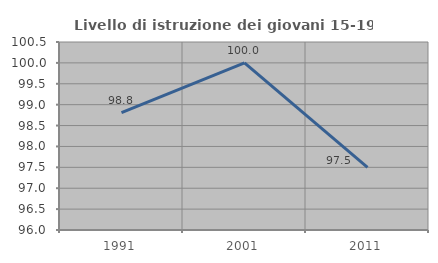
| Category | Livello di istruzione dei giovani 15-19 anni |
|---|---|
| 1991.0 | 98.81 |
| 2001.0 | 100 |
| 2011.0 | 97.5 |